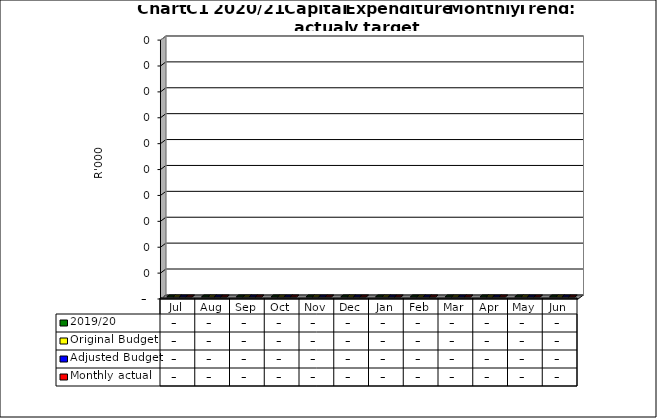
| Category | 2019/20 | Original Budget | Adjusted Budget | Monthly actual |
|---|---|---|---|---|
| Jul | 0 | 0 | 0 | 0 |
| Aug | 0 | 0 | 0 | 0 |
| Sep | 0 | 0 | 0 | 0 |
| Oct | 0 | 0 | 0 | 0 |
| Nov | 0 | 0 | 0 | 0 |
| Dec | 0 | 0 | 0 | 0 |
| Jan | 0 | 0 | 0 | 0 |
| Feb | 0 | 0 | 0 | 0 |
| Mar | 0 | 0 | 0 | 0 |
| Apr | 0 | 0 | 0 | 0 |
| May | 0 | 0 | 0 | 0 |
| Jun | 0 | 0 | 0 | 0 |